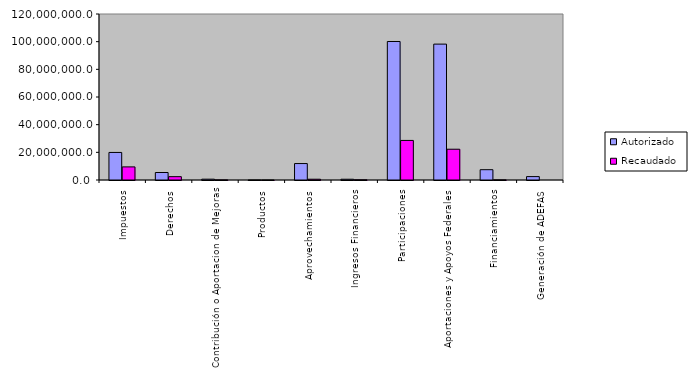
| Category | Autorizado | Recaudado |
|---|---|---|
| 0 | 19920975.3 | 9466424.6 |
| 1 | 5418672.7 | 2414732.3 |
| 2 | 597997.6 | 83352.4 |
| 3 | 15085.6 | 2975.2 |
| 4 | 11889239 | 559374 |
| 5 | 546000 | 162932.3 |
| 6 | 100121034.8 | 28603049.5 |
| 7 | 98233591.4 | 22248203 |
| 8 | 7446706.6 | 102930 |
| 9 | 2460661.3 | 0 |